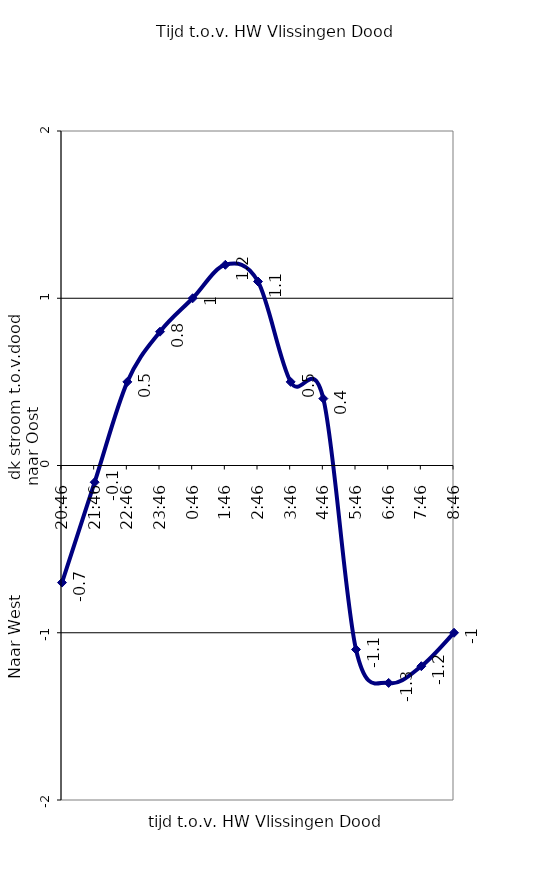
| Category | Series 0 |
|---|---|
| 1900-01-05 20:46:00 | -0.7 |
| 1900-01-04 21:46:00 | -0.1 |
| 1900-01-03 22:46:00 | 0.5 |
| 1900-01-02 23:46:00 | 0.8 |
| 1900-01-02 00:46:00 | 1 |
| 1900-01-01 01:46:00 | 1.2 |
| 0.11527777777777777 | 1.1 |
| 1900-01-01 03:46:00 | 0.5 |
| 1900-01-02 04:46:00 | 0.4 |
| 1900-01-03 05:46:00 | -1.1 |
| 1900-01-04 06:46:00 | -1.3 |
| 1900-01-05 07:46:00 | -1.2 |
| 1900-01-06 08:46:00 | -1 |